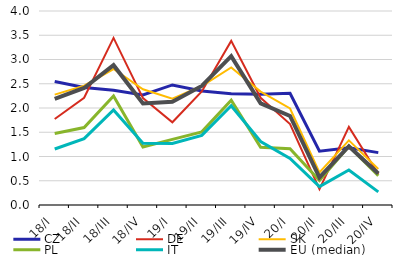
| Category | CZ | DE | SK | PL | IT | EU (median) |
|---|---|---|---|---|---|---|
| 18/I | 2.546 | 1.774 | 2.276 | 1.474 | 1.155 | 2.191 |
| 18/II | 2.422 | 2.212 | 2.459 | 1.597 | 1.368 | 2.413 |
| 18/III | 2.368 | 3.445 | 2.804 | 2.249 | 1.959 | 2.883 |
| 18/IV | 2.27 | 2.204 | 2.387 | 1.195 | 1.276 | 2.092 |
| 19/I | 2.475 | 1.706 | 2.19 | 1.353 | 1.27 | 2.128 |
| 19/II | 2.352 | 2.343 | 2.454 | 1.508 | 1.435 | 2.456 |
| 19/III | 2.296 | 3.383 | 2.835 | 2.159 | 2.045 | 3.068 |
| 19/IV | 2.286 | 2.21 | 2.339 | 1.189 | 1.308 | 2.094 |
| 20/I | 2.302 | 1.669 | 1.99 | 1.16 | 0.962 | 1.835 |
| 20/II | 1.109 | 0.325 | 0.671 | 0.505 | 0.379 | 0.569 |
| 20/III | 1.179 | 1.61 | 1.332 | 1.211 | 0.722 | 1.212 |
| 20/IV | 1.08 | 0.64 | 0.741 | 0.604 | 0.271 | 0.649 |